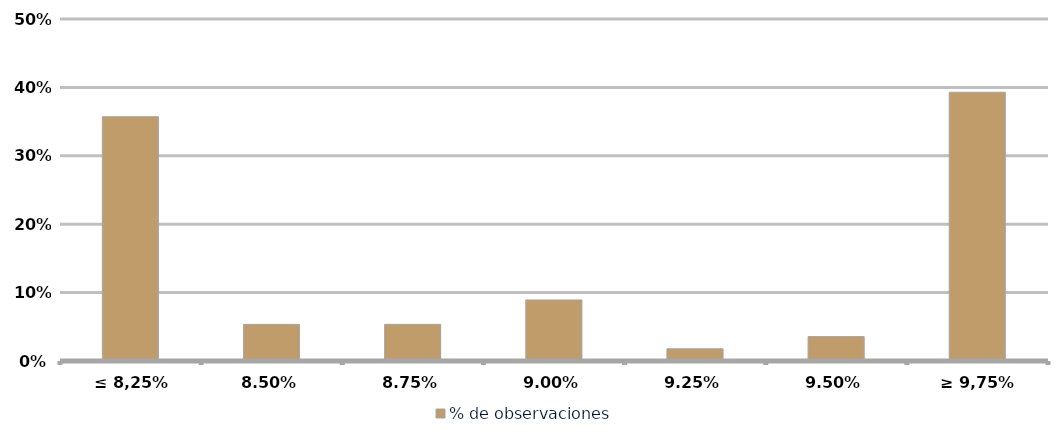
| Category | % de observaciones  |
|---|---|
| ≤ 8,25% | 0.357 |
| 8,50% | 0.054 |
| 8,75% | 0.054 |
| 9,00% | 0.089 |
| 9,25% | 0.018 |
| 9,50% | 0.036 |
| ≥ 9,75% | 0.393 |